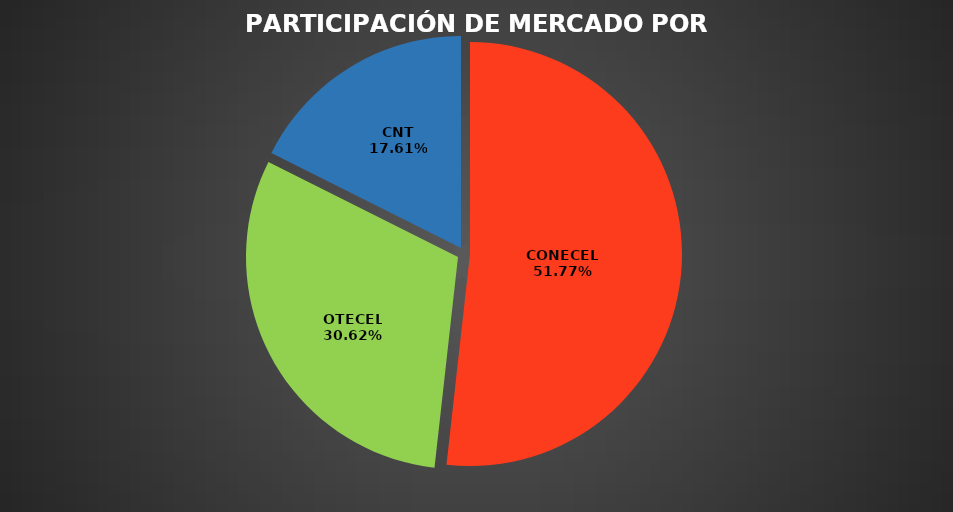
| Category | Sep 2023 |
|---|---|
| CONECEL | 9361007 |
| OTECEL | 5536629 |
| CNT | 3184663 |